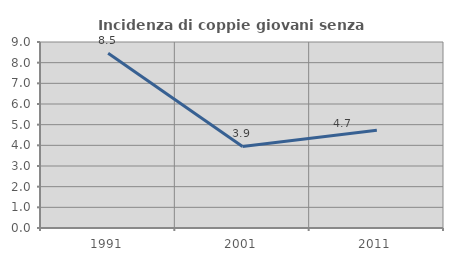
| Category | Incidenza di coppie giovani senza figli |
|---|---|
| 1991.0 | 8.451 |
| 2001.0 | 3.947 |
| 2011.0 | 4.724 |